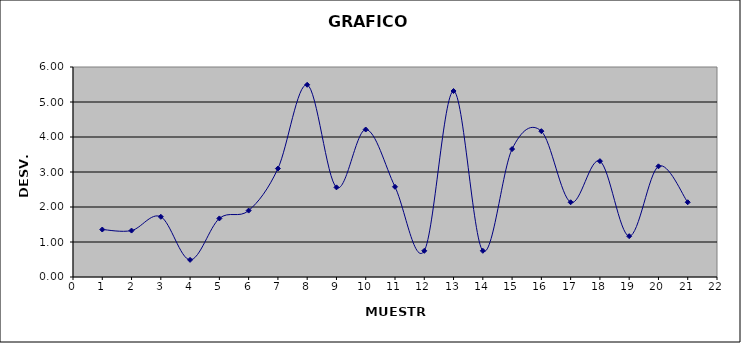
| Category | DESV. ESTANDAR |
|---|---|
| 1.0 | 1.356 |
| 2.0 | 1.327 |
| 3.0 | 1.72 |
| 4.0 | 0.49 |
| 5.0 | 1.673 |
| 6.0 | 1.897 |
| 7.0 | 3.098 |
| 8.0 | 5.492 |
| 9.0 | 2.561 |
| 10.0 | 4.214 |
| 11.0 | 2.577 |
| 12.0 | 0.748 |
| 13.0 | 5.314 |
| 14.0 | 0.748 |
| 15.0 | 3.655 |
| 16.0 | 4.167 |
| 17.0 | 2.135 |
| 18.0 | 3.311 |
| 19.0 | 1.166 |
| 20.0 | 3.162 |
| 21.0 | 2.135 |